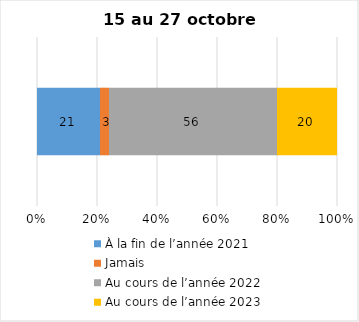
| Category | À la fin de l’année 2021 | Jamais | Au cours de l’année 2022 | Au cours de l’année 2023 |
|---|---|---|---|---|
| 0 | 21 | 3 | 56 | 20 |